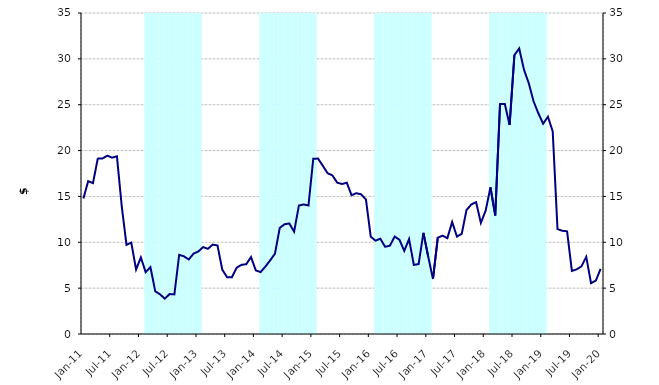
| Category | Series 1 |
|---|---|
| 0 | 0 |
| 1900-01-01 | 0 |
| 1900-01-02 | 0 |
| 1900-01-03 | 0 |
| 1900-01-04 | 0 |
| 1900-01-05 | 0 |
| 1900-01-06 | 0 |
| 1900-01-07 | 0 |
| 1900-01-08 | 0 |
| 1900-01-09 | 0 |
| 1900-01-10 | 0 |
| 1900-01-11 | 0 |
| 1900-01-12 | 0 |
| 1900-01-13 | 35000000 |
| 1900-01-14 | 35000000 |
| 1900-01-15 | 35000000 |
| 1900-01-16 | 35000000 |
| 1900-01-17 | 35000000 |
| 1900-01-18 | 35000000 |
| 1900-01-19 | 35000000 |
| 1900-01-20 | 35000000 |
| 1900-01-21 | 35000000 |
| 1900-01-22 | 35000000 |
| 1900-01-23 | 35000000 |
| 1900-01-24 | 35000000 |
| 1900-01-25 | 0 |
| 1900-01-26 | 0 |
| 1900-01-27 | 0 |
| 1900-01-28 | 0 |
| 1900-01-29 | 0 |
| 1900-01-30 | 0 |
| 1900-01-31 | 0 |
| 1900-02-01 | 0 |
| 1900-02-02 | 0 |
| 1900-02-03 | 0 |
| 1900-02-04 | 0 |
| 1900-02-05 | 0 |
| 1900-02-06 | 35000000 |
| 1900-02-07 | 35000000 |
| 1900-02-08 | 35000000 |
| 1900-02-09 | 35000000 |
| 1900-02-10 | 35000000 |
| 1900-02-11 | 35000000 |
| 1900-02-12 | 35000000 |
| 1900-02-13 | 35000000 |
| 1900-02-14 | 35000000 |
| 1900-02-15 | 35000000 |
| 1900-02-16 | 35000000 |
| 1900-02-17 | 35000000 |
| 1900-02-18 | 0 |
| 1900-02-19 | 0 |
| 1900-02-20 | 0 |
| 1900-02-21 | 0 |
| 1900-02-22 | 0 |
| 1900-02-23 | 0 |
| 1900-02-24 | 0 |
| 1900-02-25 | 0 |
| 1900-02-26 | 0 |
| 1900-02-27 | 0 |
| 1900-02-28 | 0 |
| 1900-02-28 | 0 |
| 1900-03-01 | 35000000 |
| 1900-03-02 | 35000000 |
| 1900-03-03 | 35000000 |
| 1900-03-04 | 35000000 |
| 1900-03-05 | 35000000 |
| 1900-03-06 | 35000000 |
| 1900-03-07 | 35000000 |
| 1900-03-08 | 35000000 |
| 1900-03-09 | 35000000 |
| 1900-03-10 | 35000000 |
| 1900-03-11 | 35000000 |
| 1900-03-12 | 35000000 |
| 1900-03-13 | 0 |
| 1900-03-14 | 0 |
| 1900-03-15 | 0 |
| 1900-03-16 | 0 |
| 1900-03-17 | 0 |
| 1900-03-18 | 0 |
| 1900-03-19 | 0 |
| 1900-03-20 | 0 |
| 1900-03-21 | 0 |
| 1900-03-22 | 0 |
| 1900-03-23 | 0 |
| 1900-03-24 | 0 |
| 1900-03-25 | 35000000 |
| 1900-03-26 | 35000000 |
| 1900-03-27 | 35000000 |
| 1900-03-28 | 35000000 |
| 1900-03-29 | 35000000 |
| 1900-03-30 | 35000000 |
| 1900-03-31 | 35000000 |
| 1900-04-01 | 35000000 |
| 1900-04-02 | 35000000 |
| 1900-04-03 | 35000000 |
| 1900-04-04 | 35000000 |
| 1900-04-05 | 35000000 |
| 1900-04-06 | 0 |
| 1900-04-07 | 0 |
| 1900-04-08 | 0 |
| 1900-04-09 | 0 |
| 1900-04-10 | 0 |
| 1900-04-11 | 0 |
| 1900-04-12 | 0 |
| 1900-04-13 | 0 |
| 1900-04-14 | 0 |
| 1900-04-15 | 0 |
| 1900-04-16 | 0 |
| 1900-04-17 | 0 |